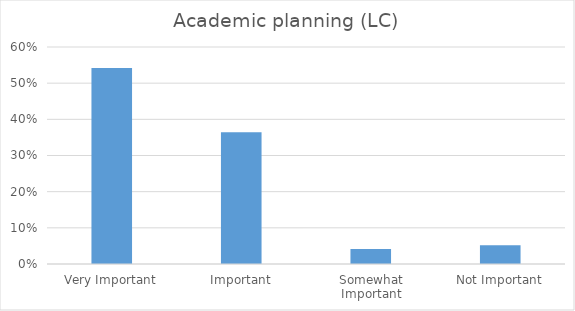
| Category | Academic planning (LC) |
|---|---|
| Very Important | 0.542 |
| Important | 0.365 |
| Somewhat Important | 0.042 |
| Not Important | 0.052 |